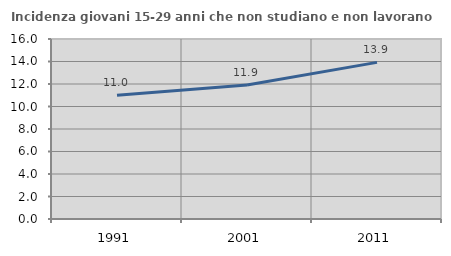
| Category | Incidenza giovani 15-29 anni che non studiano e non lavorano  |
|---|---|
| 1991.0 | 11.009 |
| 2001.0 | 11.918 |
| 2011.0 | 13.924 |